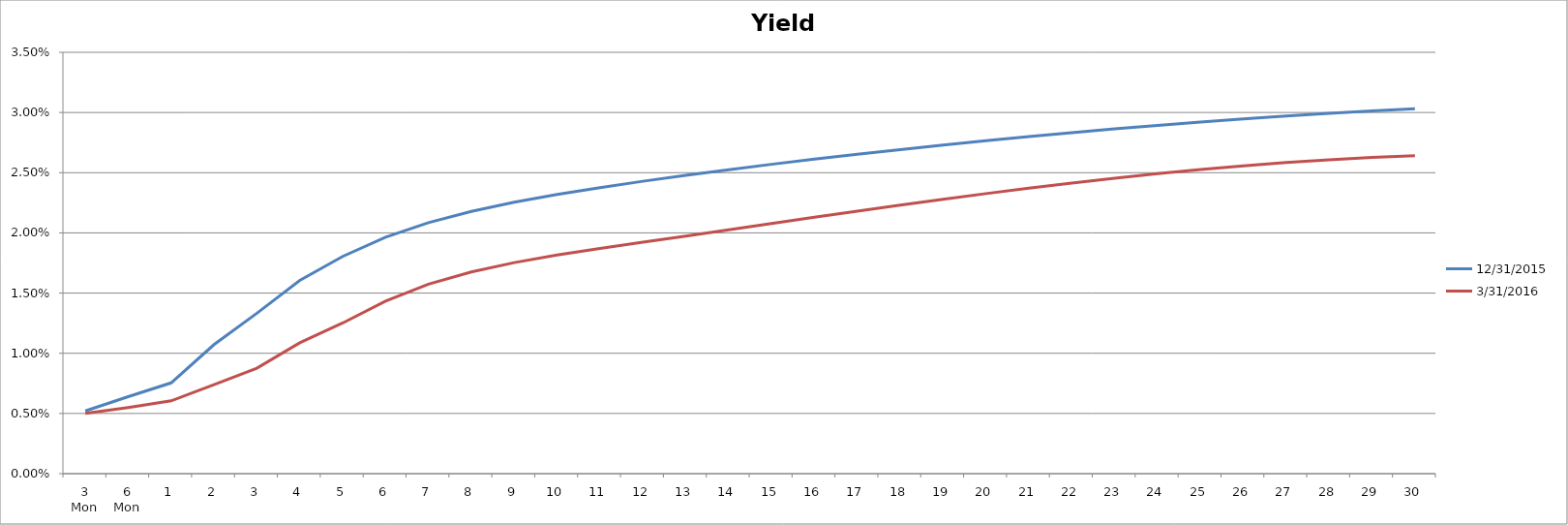
| Category | 12/31/2015 | 3/31/2016 |
|---|---|---|
| 3 Mon | 0.005 | 0.005 |
| 6 Mon | 0.006 | 0.006 |
| 1 | 0.008 | 0.006 |
| 2 | 0.011 | 0.007 |
| 3 | 0.013 | 0.009 |
| 4 | 0.016 | 0.011 |
| 5 | 0.018 | 0.013 |
| 6 | 0.02 | 0.014 |
| 7 | 0.021 | 0.016 |
| 8 | 0.022 | 0.017 |
| 9 | 0.023 | 0.018 |
| 10 | 0.023 | 0.018 |
| 11 | 0.024 | 0.019 |
| 12 | 0.024 | 0.019 |
| 13 | 0.025 | 0.02 |
| 14 | 0.025 | 0.02 |
| 15 | 0.026 | 0.021 |
| 16 | 0.026 | 0.021 |
| 17 | 0.027 | 0.022 |
| 18 | 0.027 | 0.022 |
| 19 | 0.027 | 0.023 |
| 20 | 0.028 | 0.023 |
| 21 | 0.028 | 0.024 |
| 22 | 0.028 | 0.024 |
| 23 | 0.029 | 0.025 |
| 24 | 0.029 | 0.025 |
| 25 | 0.029 | 0.025 |
| 26 | 0.029 | 0.026 |
| 27 | 0.03 | 0.026 |
| 28 | 0.03 | 0.026 |
| 29 | 0.03 | 0.026 |
| 30 | 0.03 | 0.026 |